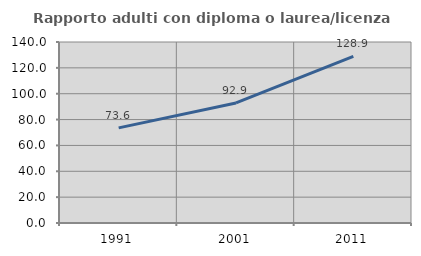
| Category | Rapporto adulti con diploma o laurea/licenza media  |
|---|---|
| 1991.0 | 73.561 |
| 2001.0 | 92.865 |
| 2011.0 | 128.947 |